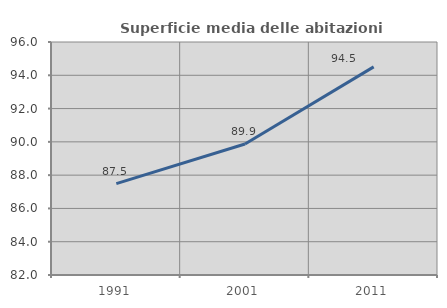
| Category | Superficie media delle abitazioni occupate |
|---|---|
| 1991.0 | 87.487 |
| 2001.0 | 89.871 |
| 2011.0 | 94.503 |